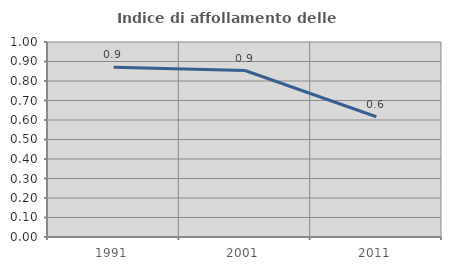
| Category | Indice di affollamento delle abitazioni  |
|---|---|
| 1991.0 | 0.87 |
| 2001.0 | 0.854 |
| 2011.0 | 0.616 |